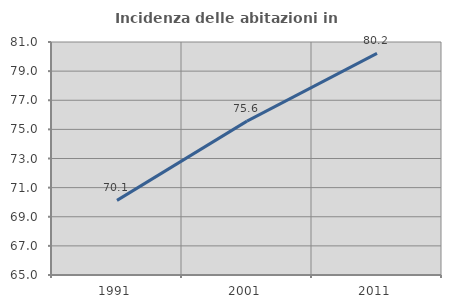
| Category | Incidenza delle abitazioni in proprietà  |
|---|---|
| 1991.0 | 70.126 |
| 2001.0 | 75.566 |
| 2011.0 | 80.22 |